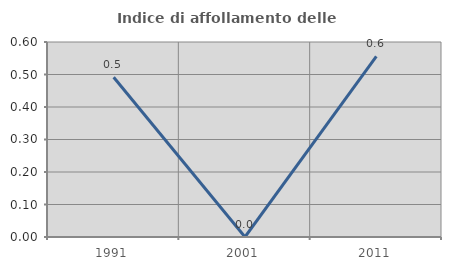
| Category | Indice di affollamento delle abitazioni  |
|---|---|
| 1991.0 | 0.491 |
| 2001.0 | 0 |
| 2011.0 | 0.556 |